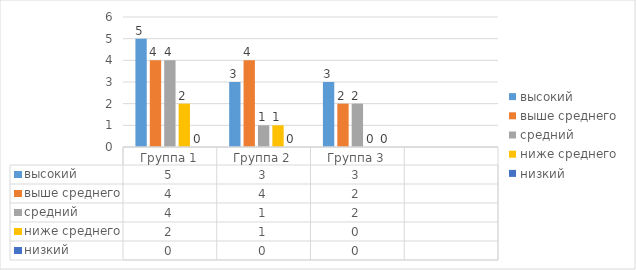
| Category | высокий | выше среднего | средний | ниже среднего | низкий |
|---|---|---|---|---|---|
| Группа 1 | 5 | 4 | 4 | 2 | 0 |
| Группа 2 | 3 | 4 | 1 | 1 | 0 |
| Группа 3 | 3 | 2 | 2 | 0 | 0 |